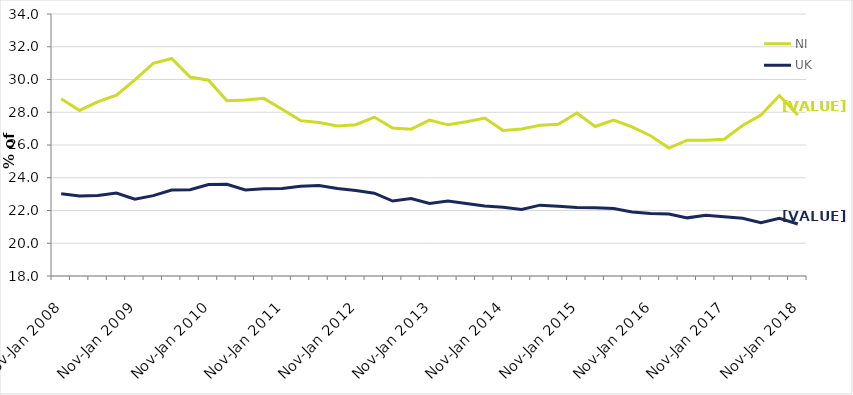
| Category | NI | UK |
|---|---|---|
| Nov-Jan 2008 | 28.821 | 23.021 |
| Feb-Apr 2008 | 28.11 | 22.885 |
| May-Jul 2008 | 28.646 | 22.919 |
| Aug-Oct 2008 | 29.05 | 23.071 |
| Nov-Jan 2009 | 29.973 | 22.695 |
| Feb-Apr 2009 | 30.984 | 22.908 |
| May-Jul 2009 | 31.286 | 23.255 |
| Aug-Oct 2009 | 30.153 | 23.274 |
| Nov-Jan 2010 | 29.959 | 23.587 |
| Feb-Apr 2010 | 28.705 | 23.606 |
| May-Jul 2010 | 28.743 | 23.252 |
| Aug-Oct 2010 | 28.847 | 23.329 |
| Nov-Jan 2011 | 28.18 | 23.34 |
| Feb-Apr 2011 | 27.489 | 23.483 |
| May-Jul 2011 | 27.377 | 23.531 |
| Aug-Oct 2011 | 27.162 | 23.344 |
| Nov-Jan 2012 | 27.239 | 23.218 |
| Feb-Apr 2012 | 27.705 | 23.058 |
| May-Jul 2012 | 27.041 | 22.577 |
| Aug-Oct 2012 | 26.965 | 22.726 |
| Nov-Jan 2013 | 27.521 | 22.423 |
| Feb-Apr 2013 | 27.231 | 22.577 |
| May-Jul 2013 | 27.414 | 22.433 |
| Aug-Oct 2013 | 27.645 | 22.269 |
| Nov-Jan 2014 | 26.888 | 22.203 |
| Feb-Apr 2014 | 26.972 | 22.058 |
| May-Jul 2014 | 27.201 | 22.327 |
| Aug-Oct 2014 | 27.267 | 22.264 |
| Nov-Jan 2015 | 27.95 | 22.18 |
| Feb-Apr 2015 | 27.128 | 22.166 |
| May-Jul 2015 | 27.524 | 22.124 |
| Aug-Oct 2015 | 27.102 | 21.908 |
| Nov-Jan 2016 | 26.568 | 21.811 |
| Feb-Apr 2016 | 25.812 | 21.779 |
| May-Jul 2016 | 26.297 | 21.551 |
| Aug-Oct 2016 | 26.285 | 21.716 |
| Nov-Jan 2017 | 26.347 | 21.617 |
| Feb-Apr 2017 | 27.187 | 21.526 |
| May-Jul 2017 | 27.825 | 21.249 |
| Aug-Oct 2017 | 29.018 | 21.517 |
| Nov-Jan 2018 | 27.835 | 21.175 |